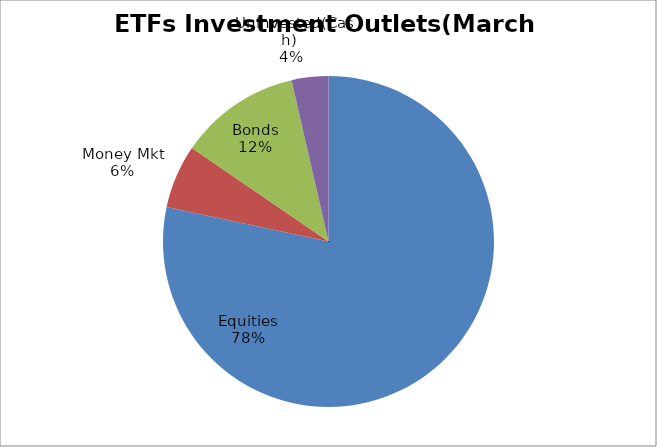
| Category | Series 0 |
|---|---|
| Equities | 3274342665.32 |
| Money Mkt | 259460908.27 |
| Bonds | 495910824.65 |
| Uninvested(Cash) | 150095912.89 |